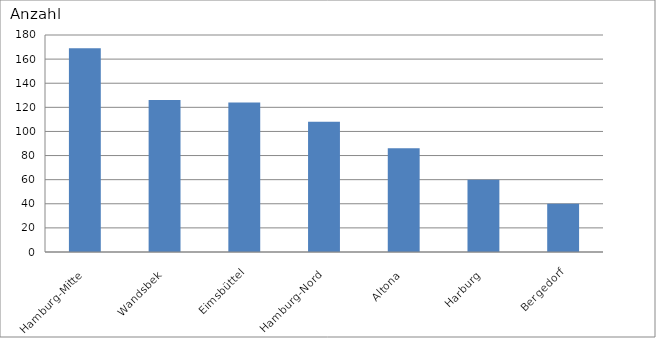
| Category | Hamburg-Mitte |
|---|---|
| Hamburg-Mitte | 169 |
| Wandsbek | 126 |
| Eimsbüttel | 124 |
| Hamburg-Nord | 108 |
| Altona | 86 |
| Harburg | 60 |
| Bergedorf | 40 |